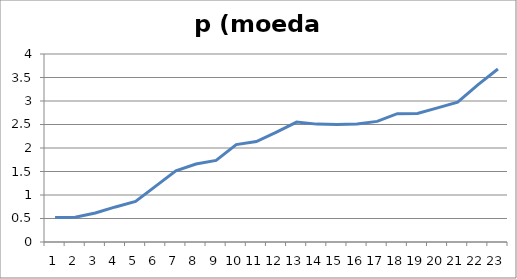
| Category | p (moeda corrente) |
|---|---|
| 0 | 0.52 |
| 1 | 0.526 |
| 2 | 0.616 |
| 3 | 0.746 |
| 4 | 0.863 |
| 5 | 1.19 |
| 6 | 1.514 |
| 7 | 1.66 |
| 8 | 1.735 |
| 9 | 2.073 |
| 10 | 2.137 |
| 11 | 2.34 |
| 12 | 2.552 |
| 13 | 2.508 |
| 14 | 2.5 |
| 15 | 2.511 |
| 16 | 2.566 |
| 17 | 2.731 |
| 18 | 2.736 |
| 19 | 2.854 |
| 20 | 2.975 |
| 21 | 3.343 |
| 22 | 3.68 |